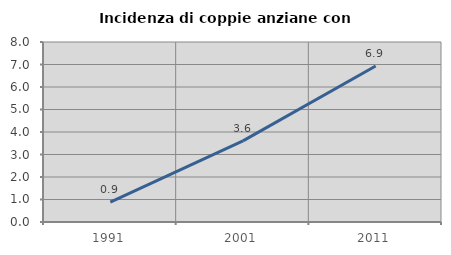
| Category | Incidenza di coppie anziane con figli |
|---|---|
| 1991.0 | 0.885 |
| 2001.0 | 3.604 |
| 2011.0 | 6.931 |